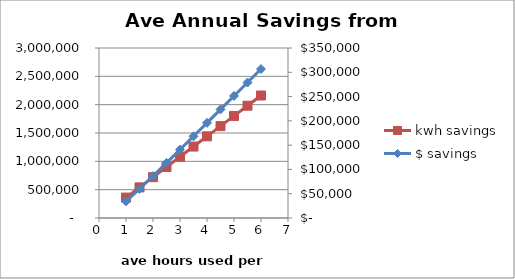
| Category | kwh savings |
|---|---|
| 1.0 | 360255 |
| 1.5 | 540382.5 |
| 2.0 | 720510 |
| 2.5 | 900637.5 |
| 3.0 | 1080765 |
| 3.5 | 1260892.5 |
| 4.0 | 1441020 |
| 4.5 | 1621147.5 |
| 5.0 | 1801275 |
| 5.5 | 1981402.5 |
| 6.0 | 2161530 |